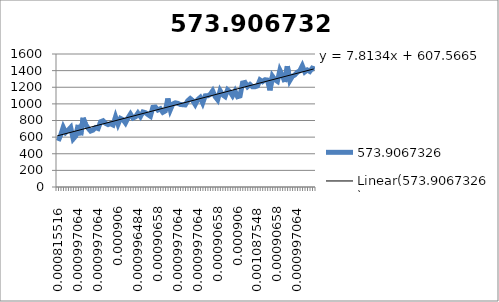
| Category | 573.9067326 |
|---|---|
| 0.000815515915320921 | 553.956 |
| 0.000815515915320921 | 626.581 |
| 0.00090657992577992 | 719.539 |
| 0.00108754789560936 | 656.498 |
| 0.000815515915320792 | 683.564 |
| 0.000997063910694642 | 716.679 |
| 0.000996483885150365 | 577.707 |
| 0.00090657992577992 | 612.311 |
| 0.000997063910694642 | 747.326 |
| 0.000996483885150236 | 623.195 |
| 0.00117861190606836 | 831.563 |
| 0.00108754789560936 | 751.369 |
| 0.000905999900235643 | 708.036 |
| 0.000997063910694513 | 672.648 |
| 0.000997063910694642 | 684.575 |
| 0.000815515915320921 | 714.211 |
| 0.000997063910694642 | 703.115 |
| 0.000815515915320921 | 784.586 |
| 0.000905999900235643 | 796.716 |
| 0.00090657992577992 | 765.693 |
| 0.000997063910694642 | 750.539 |
| 0.000905999900235514 | 762.058 |
| 0.000997063910694642 | 746.526 |
| 0.000997063910694642 | 843.717 |
| 0.000905999900235643 | 753.783 |
| 0.000997063910694642 | 825.466 |
| 0.000997063910694642 | 810.625 |
| 0.00108754789560923 | 769.839 |
| 0.00108754789560936 | 830.858 |
| 0.00108754789560936 | 878.493 |
| 0.000815515915320921 | 829.142 |
| 0.000997063910694642 | 843.246 |
| 0.000996483885150236 | 888.695 |
| 0.00090657992577992 | 847.188 |
| 0.000997063910694642 | 902.557 |
| 0.000815515915320921 | 893.891 |
| 0.000997063910694642 | 871.237 |
| 0.00108754789560923 | 851.122 |
| 0.000815515915320921 | 958.515 |
| 0.000815515915320921 | 962.362 |
| 0.00090657992577992 | 925.94 |
| 0.000996483885150365 | 940.891 |
| 0.00090657992577992 | 898.357 |
| 0.000997063910694642 | 915.08 |
| 0.00108754789560936 | 1065.014 |
| 0.00108754789560923 | 928.299 |
| 0.00108754789560936 | 998.988 |
| 0.000996483885150236 | 1012.583 |
| 0.000997063910694642 | 1006.706 |
| 0.000997063910694642 | 992.366 |
| 0.000997063910694642 | 990.031 |
| 0.000815515915320921 | 987.328 |
| 0.000997063910694642 | 1037.541 |
| 0.000815515915320921 | 1064.168 |
| 0.000997063910694642 | 1039.649 |
| 0.000815515915320921 | 991.692 |
| 0.000997063910694513 | 1051.63 |
| 0.000905999900235643 | 1077.332 |
| 0.000997063910694642 | 1010.562 |
| 0.000997063910694642 | 1096.342 |
| 0.000996483885150236 | 1096.797 |
| 0.000997063910694642 | 1113.197 |
| 0.00108754789560936 | 1156.884 |
| 0.00108754789560936 | 1087.699 |
| 0.00090657992577992 | 1048.997 |
| 0.000815515915320921 | 1159.022 |
| 0.000997063910694642 | 1108.951 |
| 0.00108754789560923 | 1087.691 |
| 0.000905999900235643 | 1169.656 |
| 0.00090657992577992 | 1144.659 |
| 0.000815515915320921 | 1097.675 |
| 0.000997063910694642 | 1154.156 |
| 0.000905999900235643 | 1086.5 |
| 0.000997063910694513 | 1095.332 |
| 0.000997063910694642 | 1250.642 |
| 0.000905999900235643 | 1257.694 |
| 0.000997063910694642 | 1206.995 |
| 0.000997063910694642 | 1233.441 |
| 0.00108754789560936 | 1205.49 |
| 0.00108754789560923 | 1206.125 |
| 0.00108754789560936 | 1215.952 |
| 0.000905999900235643 | 1288.176 |
| 0.000997063910694513 | 1267.45 |
| 0.000997063910694642 | 1290.26 |
| 0.000905999900235643 | 1286.656 |
| 0.00090657992577992 | 1163.043 |
| 0.000905999900235643 | 1333.484 |
| 0.000997063910694642 | 1290.848 |
| 0.00090657992577992 | 1271 |
| 0.000815515915320921 | 1404.792 |
| 0.000815515915320921 | 1342.167 |
| 0.000997063910694642 | 1263.289 |
| 0.000996483885150236 | 1453.148 |
| 0.00090657992577992 | 1280.513 |
| 0.00108754789560936 | 1330.616 |
| 0.000997063910694642 | 1348.631 |
| 0.000997063910694642 | 1381.527 |
| 0.00117803188052396 | 1398.633 |
| 0.000905999900235643 | 1459.244 |
| 0.000997063910694642 | 1384.575 |
| 0.000997063910694642 | 1407.926 |
| 0.000996483885150236 | 1390.06 |
| 0.000997063910694642 | 1429.718 |
| 0.00090657992577992 | 1418.803 |